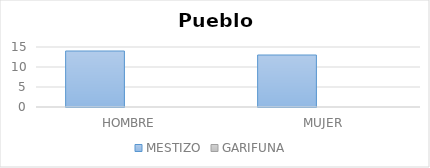
| Category | MESTIZO | GARIFUNA  |
|---|---|---|
| HOMBRE  | 14 | 0 |
| MUJER | 13 | 0 |